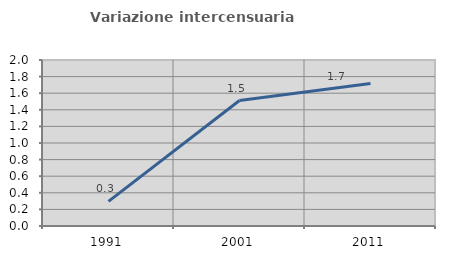
| Category | Variazione intercensuaria annua |
|---|---|
| 1991.0 | 0.297 |
| 2001.0 | 1.512 |
| 2011.0 | 1.716 |